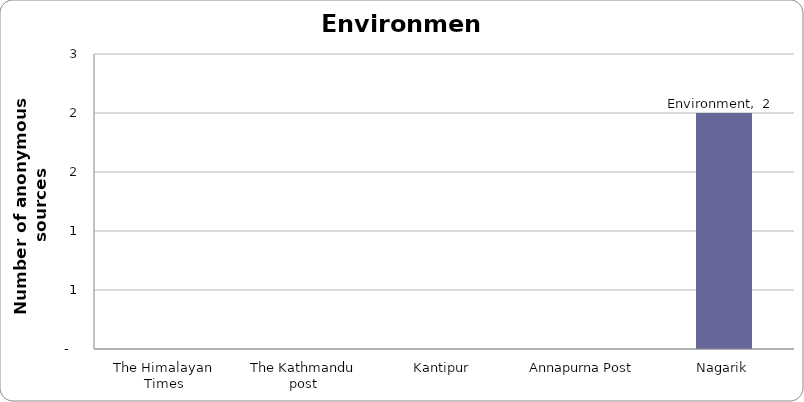
| Category | Environment |
|---|---|
| The Himalayan Times | 0 |
| The Kathmandu post | 0 |
| Kantipur | 0 |
| Annapurna Post | 0 |
| Nagarik | 2 |